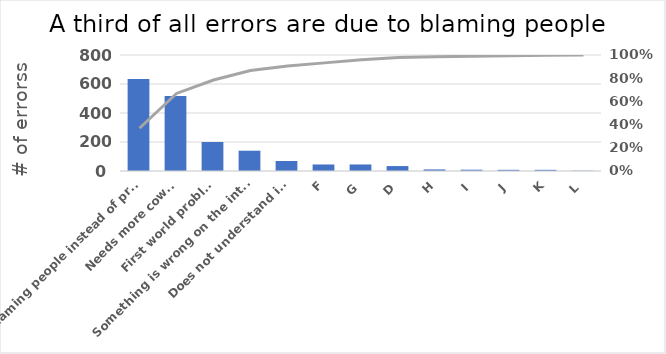
| Category | Count of thing |
|---|---|
| Blaming people instead of process | 635 |
| Needs more cowbell | 517 |
| First world problems | 200 |
| Something is wrong on the internet | 140 |
| Does not understand irony | 69 |
| F | 45 |
| G | 45 |
| D | 34 |
| H | 11 |
| I | 9 |
| J | 8 |
| K | 8 |
| L | 2 |